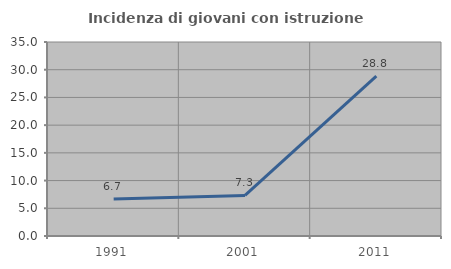
| Category | Incidenza di giovani con istruzione universitaria |
|---|---|
| 1991.0 | 6.667 |
| 2001.0 | 7.317 |
| 2011.0 | 28.846 |